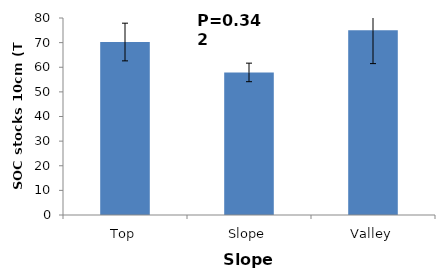
| Category | Series 0 |
|---|---|
| Top | 70.242 |
| Slope | 57.899 |
| Valley | 74.978 |